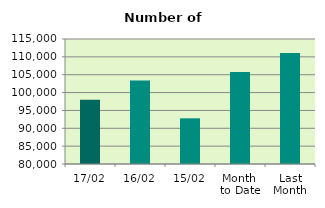
| Category | Series 0 |
|---|---|
| 17/02 | 97972 |
| 16/02 | 103408 |
| 15/02 | 92790 |
| Month 
to Date | 105789.846 |
| Last
Month | 111077.545 |